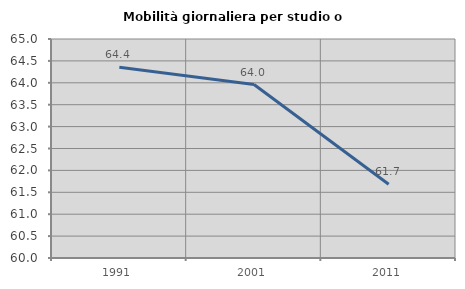
| Category | Mobilità giornaliera per studio o lavoro |
|---|---|
| 1991.0 | 64.354 |
| 2001.0 | 63.961 |
| 2011.0 | 61.682 |